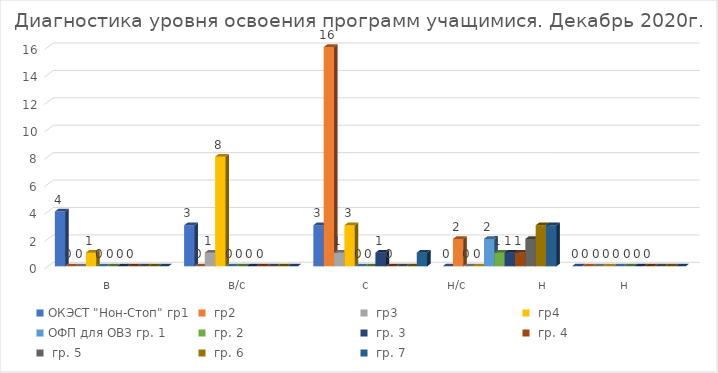
| Category | ОКЭСТ "Нон-Стоп" | ОФП для ОВЗ |
|---|---|---|
| в | 1 | 0 |
| в/с | 8 | 0 |
| с | 3 | 1 |
| н/с                  н | 0 | 3 |
| н | 0 | 0 |